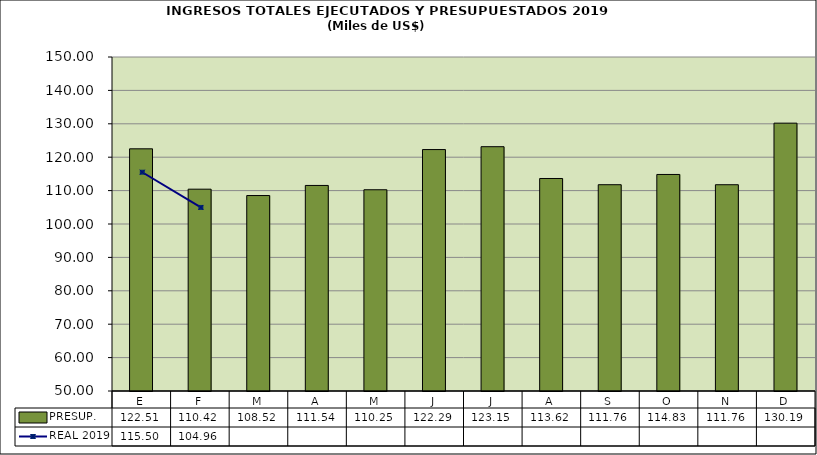
| Category | PRESUP. |
|---|---|
| E | 122.51 |
| F | 110.425 |
| M | 108.523 |
| A | 111.541 |
| M | 110.25 |
| J | 122.287 |
| J | 123.146 |
| A | 113.624 |
| S | 111.762 |
| O | 114.831 |
| N | 111.76 |
| D | 130.194 |